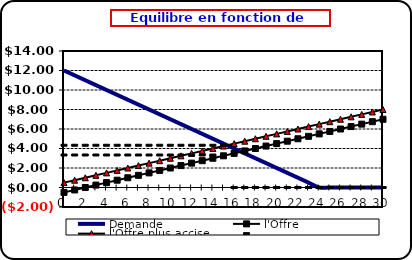
| Category | Demande | l'Offre | l'Offre plus accise | Series 3 | Series 4 |
|---|---|---|---|---|---|
| 0.0 | 12 | -0.5 | 0.5 | 4.333 | 3.333 |
| 1.0 | 11.5 | -0.25 | 0.75 | 4.333 | 3.333 |
| 2.0 | 11 | 0 | 1 | 4.333 | 3.333 |
| 3.0 | 10.5 | 0.25 | 1.25 | 4.333 | 3.333 |
| 4.0 | 10 | 0.5 | 1.5 | 4.333 | 3.333 |
| 5.0 | 9.5 | 0.75 | 1.75 | 4.333 | 3.333 |
| 6.0 | 9 | 1 | 2 | 4.333 | 3.333 |
| 7.0 | 8.5 | 1.25 | 2.25 | 4.333 | 3.333 |
| 8.0 | 8 | 1.5 | 2.5 | 4.333 | 3.333 |
| 9.0 | 7.5 | 1.75 | 2.75 | 4.333 | 3.333 |
| 10.0 | 7 | 2 | 3 | 4.333 | 3.333 |
| 11.0 | 6.5 | 2.25 | 3.25 | 4.333 | 3.333 |
| 12.0 | 6 | 2.5 | 3.5 | 4.333 | 3.333 |
| 13.0 | 5.5 | 2.75 | 3.75 | 4.333 | 3.333 |
| 14.0 | 5 | 3 | 4 | 4.333 | 3.333 |
| 15.0 | 4.5 | 3.25 | 4.25 | 4.333 | 3.333 |
| 16.0 | 4 | 3.5 | 4.5 | 0 | 0 |
| 17.0 | 3.5 | 3.75 | 4.75 | 0 | 0 |
| 18.0 | 3 | 4 | 5 | 0 | 0 |
| 19.0 | 2.5 | 4.25 | 5.25 | 0 | 0 |
| 20.0 | 2 | 4.5 | 5.5 | 0 | 0 |
| 21.0 | 1.5 | 4.75 | 5.75 | 0 | 0 |
| 22.0 | 1 | 5 | 6 | 0 | 0 |
| 23.0 | 0.5 | 5.25 | 6.25 | 0 | 0 |
| 24.0 | 0 | 5.5 | 6.5 | 0 | 0 |
| 25.0 | 0 | 5.75 | 6.75 | 0 | 0 |
| 26.0 | 0 | 6 | 7 | 0 | 0 |
| 27.0 | 0 | 6.25 | 7.25 | 0 | 0 |
| 28.0 | 0 | 6.5 | 7.5 | 0 | 0 |
| 29.0 | 0 | 6.75 | 7.75 | 0 | 0 |
| 30.0 | 0 | 7 | 8 | 0 | 0 |